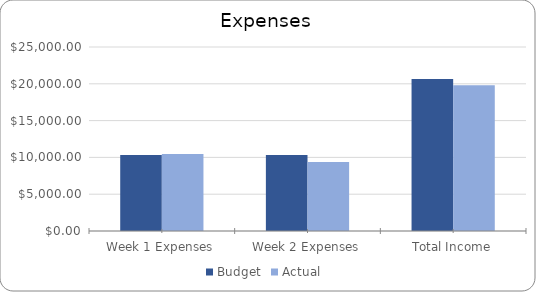
| Category | Budget | Actual  |
|---|---|---|
| Week 1 Expenses | 10325 | 10455 |
| Week 2 Expenses | 10325 | 9362 |
| Total Income | 20650 | 19817 |